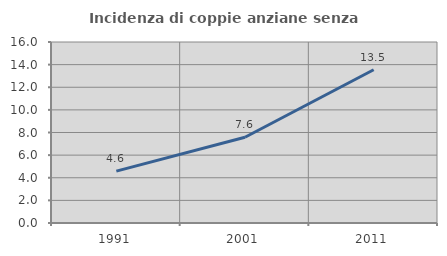
| Category | Incidenza di coppie anziane senza figli  |
|---|---|
| 1991.0 | 4.589 |
| 2001.0 | 7.577 |
| 2011.0 | 13.549 |